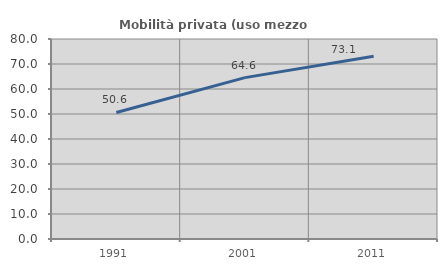
| Category | Mobilità privata (uso mezzo privato) |
|---|---|
| 1991.0 | 50.61 |
| 2001.0 | 64.551 |
| 2011.0 | 73.128 |